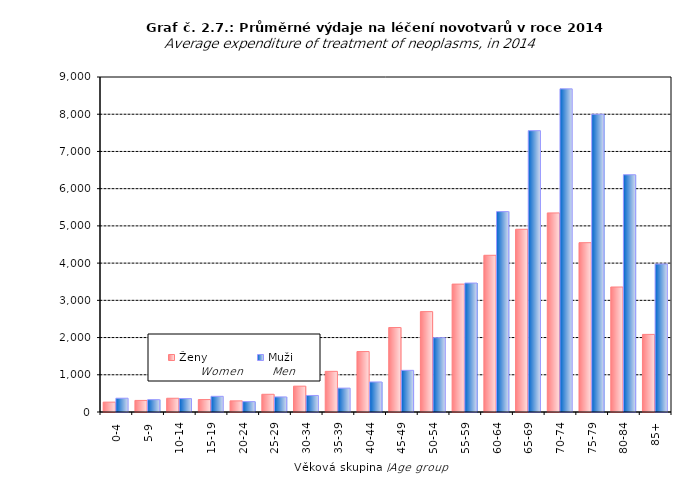
| Category | Ženy
 | Muži
 |
|---|---|---|
| 0-4 | 265 | 370 |
| 5-9 | 311 | 331 |
| 10-14 | 369 | 360 |
| 15-19 | 334 | 421 |
| 20-24 | 299 | 279 |
| 25-29 | 476 | 405 |
| 30-34 | 694 | 444 |
| 35-39 | 1092 | 641 |
| 40-44 | 1624 | 807 |
| 45-49 | 2269 | 1119 |
| 50-54 | 2697 | 1997 |
| 55-59 | 3436 | 3464 |
| 60-64 | 4210 | 5384 |
| 65-69 | 4909 | 7558 |
| 70-74 | 5348 | 8681 |
| 75-79 | 4549 | 7999 |
| 80-84 | 3358 | 6374 |
| 85+ | 2085 | 3975 |